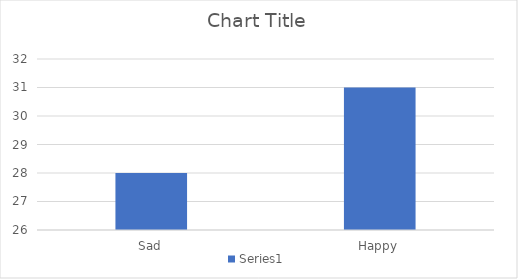
| Category | Series 0 |
|---|---|
| Sad | 28 |
| Happy | 31 |